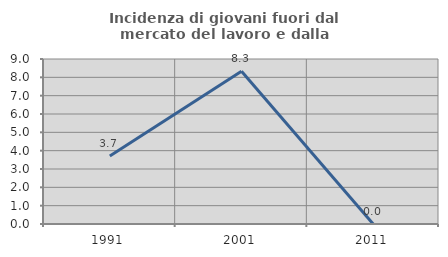
| Category | Incidenza di giovani fuori dal mercato del lavoro e dalla formazione  |
|---|---|
| 1991.0 | 3.704 |
| 2001.0 | 8.333 |
| 2011.0 | 0 |